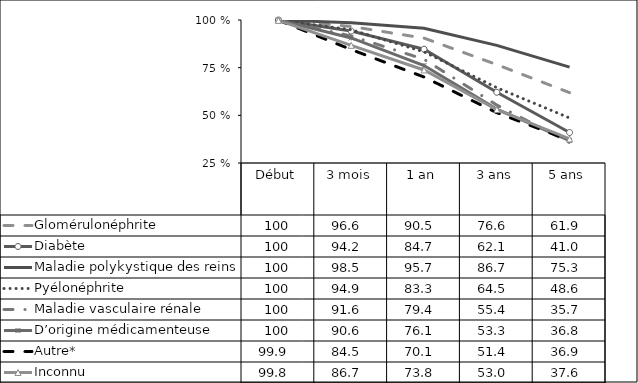
| Category | Glomérulonéphrite | Diabète | Maladie polykystique des reins | Pyélonéphrite | Maladie vasculaire rénale | D’origine médicamenteuse | Autre* | Inconnu |
|---|---|---|---|---|---|---|---|---|
| Début | 100 | 100 | 100 | 100 | 100 | 100 | 99.9 | 99.8 |
| 3 mois | 96.6 | 94.2 | 98.5 | 94.9 | 91.6 | 90.6 | 84.5 | 86.7 |
| 1 an | 90.5 | 84.7 | 95.7 | 83.3 | 79.4 | 76.1 | 70.1 | 73.8 |
| 3 ans | 76.6 | 62.1 | 86.7 | 64.5 | 55.4 | 53.3 | 51.4 | 53 |
| 5 ans | 61.9 | 41 | 75.3 | 48.6 | 35.7 | 36.8 | 36.9 | 37.6 |